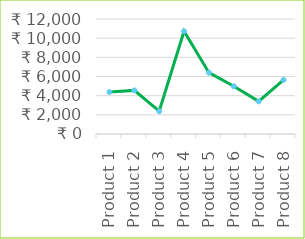
| Category | Series 1 |
|---|---|
| Product 1 | 4375 |
| Product 2 | 4551.25 |
| Product 3 | 2380 |
| Product 4 | 10725 |
| Product 5 | 6400 |
| Product 6 | 4980 |
| Product 7 | 3403 |
| Product 8 | 5649.6 |